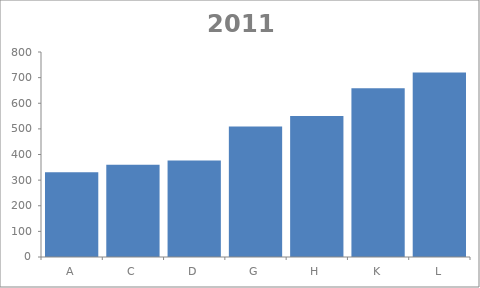
| Category | 2011 |
|---|---|
| A | 330.33 |
| C | 359.85 |
| D | 376.94 |
| G | 509.38 |
| H | 549.9 |
| K | 658.24 |
| L | 720.2 |